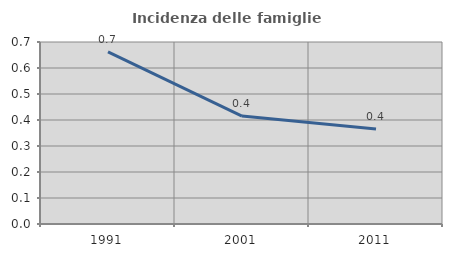
| Category | Incidenza delle famiglie numerose |
|---|---|
| 1991.0 | 0.662 |
| 2001.0 | 0.415 |
| 2011.0 | 0.365 |